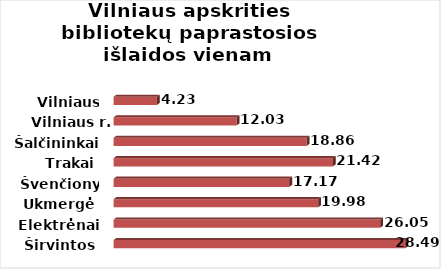
| Category | Series 0 |
|---|---|
| Širvintos | 28.494 |
| Elektrėnai | 26.055 |
| Ukmergė | 19.985 |
| Švenčionys | 17.171 |
| Trakai | 21.421 |
| Šalčininkai | 18.859 |
| Vilniaus r. | 12.025 |
| Vilniaus m. | 4.231 |